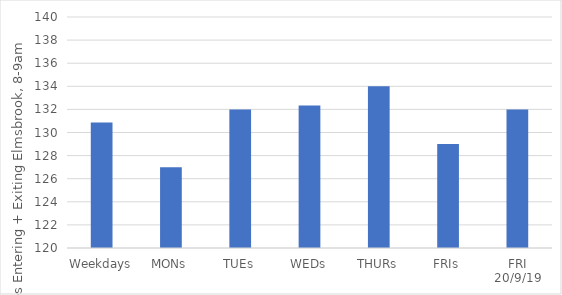
| Category | Series 0 |
|---|---|
| Weekdays | 130.867 |
| MONs | 127 |
| TUEs | 132 |
| WEDs | 132.333 |
| THURs | 134 |
| FRIs | 129 |
| FRI 20/9/19 | 132 |